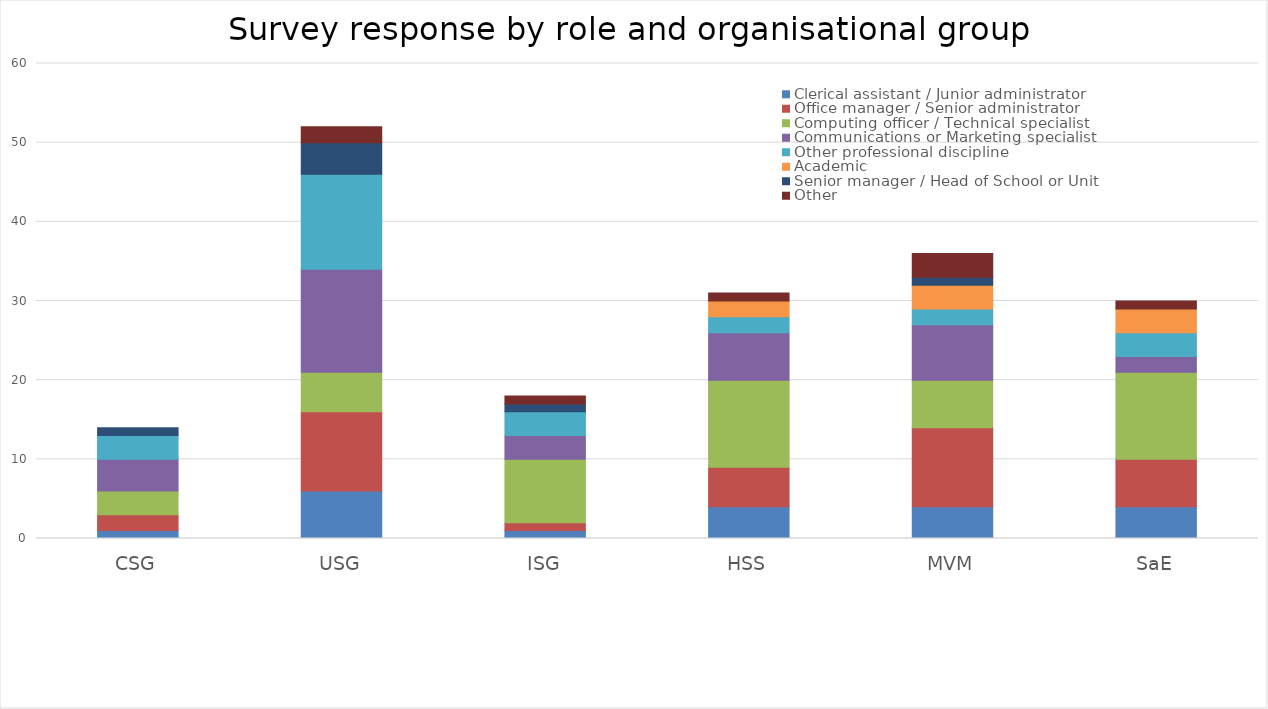
| Category | Clerical assistant / Junior administrator | Office manager / Senior administrator | Computing officer / Technical specialist | Communications or Marketing specialist | Other professional discipline | Academic | Senior manager / Head of School or Unit | Other  |
|---|---|---|---|---|---|---|---|---|
| CSG | 1 | 2 | 3 | 4 | 3 | 0 | 1 | 0 |
| USG | 6 | 10 | 5 | 13 | 12 | 0 | 4 | 2 |
| ISG | 1 | 1 | 8 | 3 | 3 | 0 | 1 | 1 |
| HSS | 4 | 5 | 11 | 6 | 2 | 2 | 0 | 1 |
| MVM | 4 | 10 | 6 | 7 | 2 | 3 | 1 | 3 |
| SaE | 4 | 6 | 11 | 2 | 3 | 3 | 0 | 1 |